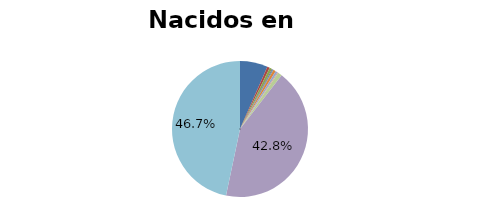
| Category | Nacidos en Haití |
|---|---|
| Mapuche | 0.066 |
| Aymara | 0.006 |
| Rapa Nui | 0.006 |
| Lican Antai | 0.002 |
| Quechua | 0.002 |
| Colla | 0.006 |
| Diaguita | 0.005 |
| Kawésqar | 0.002 |
| Yagán o Yámana | 0.01 |
| Otro | 0.428 |
| Pueblo ignorado | 0.467 |